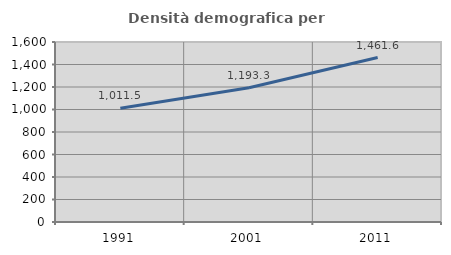
| Category | Densità demografica |
|---|---|
| 1991.0 | 1011.474 |
| 2001.0 | 1193.275 |
| 2011.0 | 1461.616 |